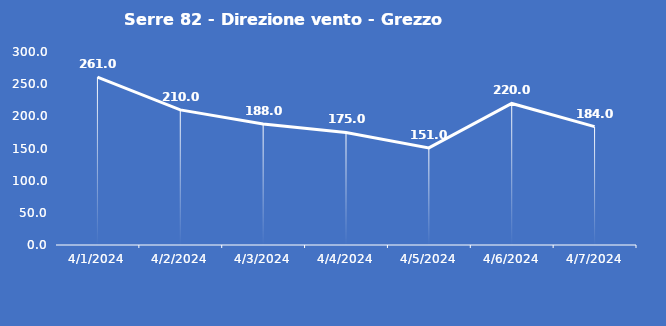
| Category | Serre 82 - Direzione vento - Grezzo (°N) |
|---|---|
| 4/1/24 | 261 |
| 4/2/24 | 210 |
| 4/3/24 | 188 |
| 4/4/24 | 175 |
| 4/5/24 | 151 |
| 4/6/24 | 220 |
| 4/7/24 | 184 |